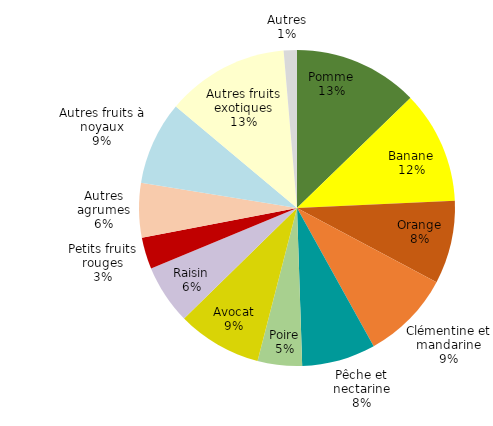
| Category | Series 0 |
|---|---|
| Pomme | 0.127 |
| Banane | 0.115 |
| Orange | 0.085 |
| Clémentine et mandarine | 0.092 |
| Pêche et nectarine | 0.075 |
| Poire | 0.045 |
| Avocat | 0.087 |
| Raisin | 0.061 |
| Petits fruits rouges | 0.032 |
| Autres agrumes | 0.056 |
| Autres fruits à noyaux | 0.085 |
| Autres fruits exotiques | 0.126 |
| Autres | 0.014 |